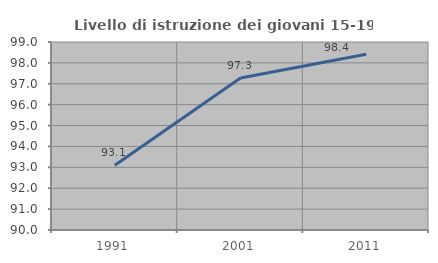
| Category | Livello di istruzione dei giovani 15-19 anni |
|---|---|
| 1991.0 | 93.096 |
| 2001.0 | 97.273 |
| 2011.0 | 98.413 |